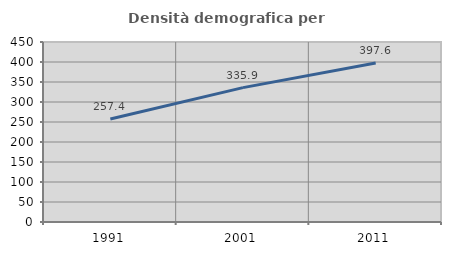
| Category | Densità demografica |
|---|---|
| 1991.0 | 257.392 |
| 2001.0 | 335.912 |
| 2011.0 | 397.64 |